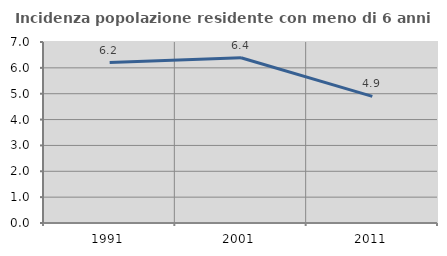
| Category | Incidenza popolazione residente con meno di 6 anni |
|---|---|
| 1991.0 | 6.204 |
| 2001.0 | 6.39 |
| 2011.0 | 4.895 |